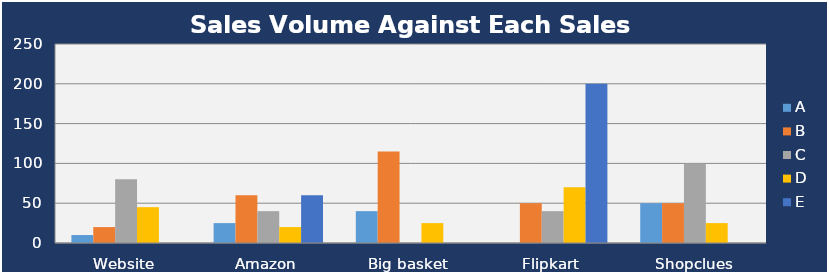
| Category | A | B | C | D | E |
|---|---|---|---|---|---|
| Website | 10 | 20 | 80 | 45 | 0 |
| Amazon | 25 | 60 | 40 | 20 | 60 |
| Big basket | 40 | 115 | 0 | 25 | 0 |
| Flipkart | 0 | 50 | 40 | 70 | 200 |
| Shopclues | 50 | 50 | 100 | 25 | 0 |